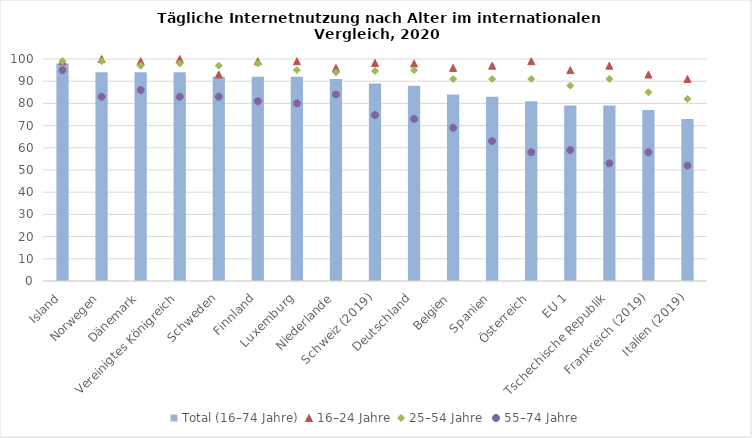
| Category | Total (16–74 Jahre) |
|---|---|
| Island | 98 |
| Norwegen | 94 |
| Dänemark | 94 |
| Vereinigtes Königreich | 94 |
| Schweden | 92 |
| Finnland | 92 |
| Luxemburg | 92 |
| Niederlande | 91 |
| Schweiz (2019) | 89.02 |
| Deutschland | 88 |
| Belgien | 84 |
| Spanien | 83 |
| Österreich | 81 |
| EU 1 | 79 |
| Tschechische Republik | 79 |
| Frankreich (2019) | 77 |
| Italien (2019) | 73 |